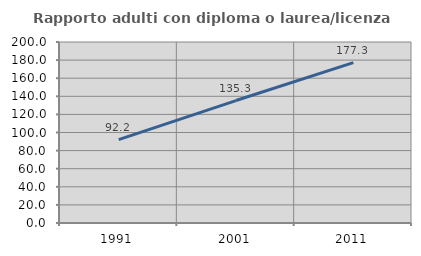
| Category | Rapporto adulti con diploma o laurea/licenza media  |
|---|---|
| 1991.0 | 92.153 |
| 2001.0 | 135.305 |
| 2011.0 | 177.26 |